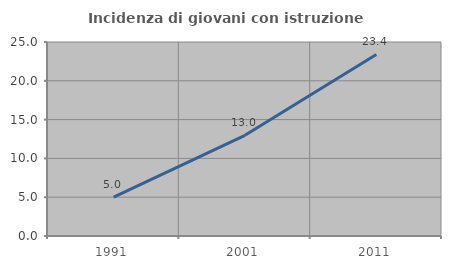
| Category | Incidenza di giovani con istruzione universitaria |
|---|---|
| 1991.0 | 5.023 |
| 2001.0 | 12.971 |
| 2011.0 | 23.392 |